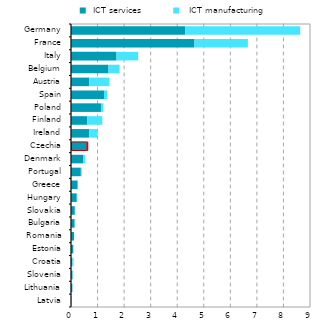
| Category |  ICT services  |   ICT manufacturing |
|---|---|---|
| Latvia | 0.01 | 0.001 |
| Lithuania | 0.051 | 0.007 |
| Slovenia | 0.058 | 0.014 |
| Croatia | 0.041 | 0.055 |
| Estonia | 0.082 | 0.015 |
| Romania | 0.114 | 0.002 |
| Bulgaria | 0.135 | 0.007 |
| Slovakia | 0.142 | 0.003 |
| Hungary | 0.217 | 0.016 |
| Greece | 0.249 | 0.008 |
| Portugal | 0.37 | 0.034 |
| Denmark | 0.464 | 0.061 |
| Czechia | 0.595 | 0.038 |
| Ireland | 0.687 | 0.317 |
| Finland | 0.612 | 0.568 |
| Poland | 1.128 | 0.092 |
| Spain | 1.243 | 0.116 |
| Austria | 0.687 | 0.763 |
| Belgium | 1.412 | 0.418 |
| Italy | 1.715 | 0.814 |
| France | 4.65 | 2.01 |
| Germany | 4.302 | 4.328 |